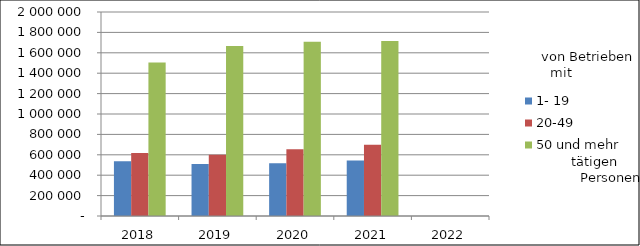
| Category | 1- 19 | 20-49 | 50 und mehr |
|---|---|---|---|
| 2018.0 | 536024.379 | 617872.882 | 1504659.932 |
| 2019.0 | 508788.577 | 600739.035 | 1666354.201 |
| 2020.0 | 517241.437 | 654868.01 | 1708607.175 |
| 2021.0 | 543800.942 | 697922.588 | 1715823.431 |
| 2022.0 | 0 | 0 | 0 |